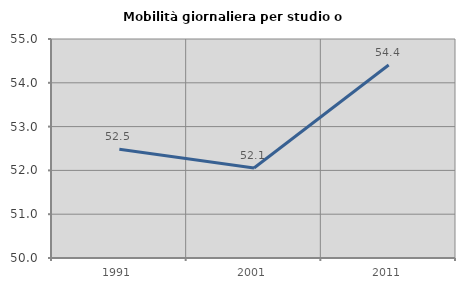
| Category | Mobilità giornaliera per studio o lavoro |
|---|---|
| 1991.0 | 52.481 |
| 2001.0 | 52.053 |
| 2011.0 | 54.405 |